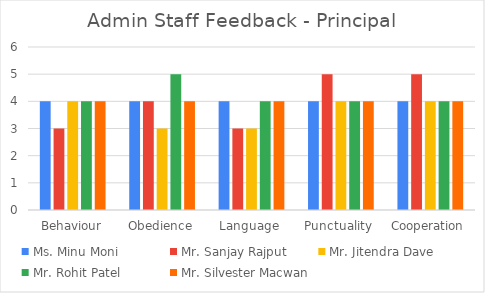
| Category | Ms. Minu Moni | Mr. Sanjay Rajput | Mr. Jitendra Dave | Mr. Rohit Patel | Mr. Silvester Macwan |
|---|---|---|---|---|---|
| Behaviour | 4 | 3 | 4 | 4 | 4 |
| Obedience | 4 | 4 | 3 | 5 | 4 |
| Language | 4 | 3 | 3 | 4 | 4 |
| Punctuality  | 4 | 5 | 4 | 4 | 4 |
| Cooperation | 4 | 5 | 4 | 4 | 4 |